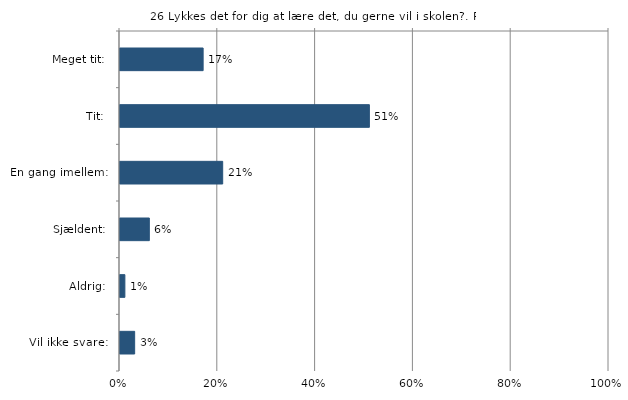
| Category | Lykkes det for dig at lære det, du gerne vil i skolen? |
|---|---|
| Meget tit:  | 0.17 |
| Tit:  | 0.51 |
| En gang imellem:  | 0.21 |
| Sjældent:  | 0.06 |
| Aldrig:  | 0.01 |
| Vil ikke svare:  | 0.03 |